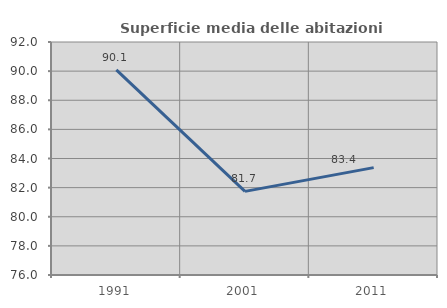
| Category | Superficie media delle abitazioni occupate |
|---|---|
| 1991.0 | 90.09 |
| 2001.0 | 81.743 |
| 2011.0 | 83.372 |